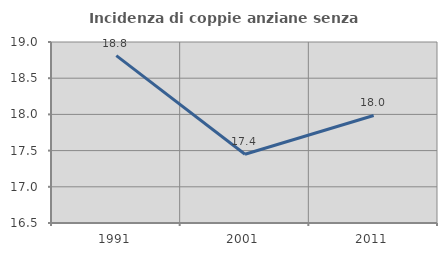
| Category | Incidenza di coppie anziane senza figli  |
|---|---|
| 1991.0 | 18.812 |
| 2001.0 | 17.45 |
| 2011.0 | 17.986 |